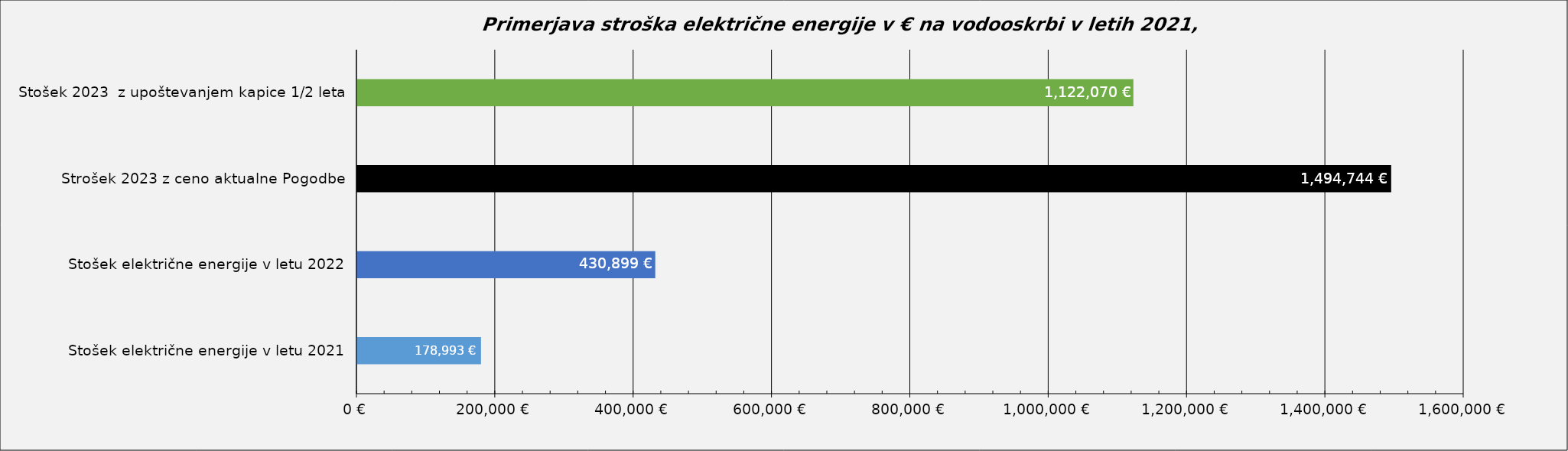
| Category | Series 0 |
|---|---|
| Stošek električne energije v letu 2021 | 178993 |
| Stošek električne energije v letu 2022 | 430899 |
| Strošek 2023 z ceno aktualne Pogodbe | 1494744.41 |
| Stošek 2023  z upoštevanjem kapice 1/2 leta | 1122070 |